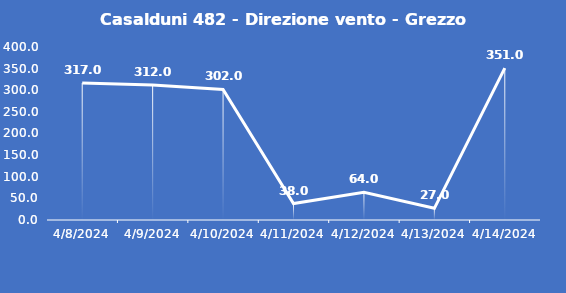
| Category | Casalduni 482 - Direzione vento - Grezzo (°N) |
|---|---|
| 4/8/24 | 317 |
| 4/9/24 | 312 |
| 4/10/24 | 302 |
| 4/11/24 | 38 |
| 4/12/24 | 64 |
| 4/13/24 | 27 |
| 4/14/24 | 351 |